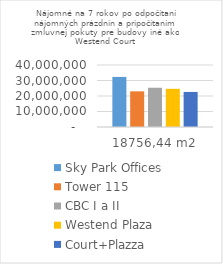
| Category | Sky Park Offices | Tower 115 | CBC I a II | Westend Plaza | Court+Plazza |
|---|---|---|---|---|---|
| 18756,44 m2 | 32313708.77 | 22998653.39 | 25322937.898 | 24630338.96 | 22625024.85 |